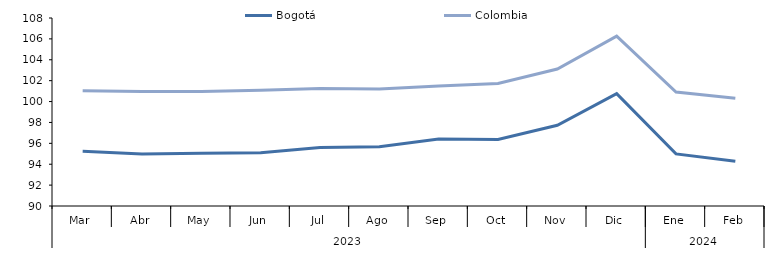
| Category | Bogotá | Colombia |
|---|---|---|
| 0 | 95.248 | 101.039 |
| 1 | 94.987 | 100.971 |
| 2 | 95.048 | 100.959 |
| 3 | 95.105 | 101.08 |
| 4 | 95.6 | 101.25 |
| 5 | 95.667 | 101.212 |
| 6 | 96.412 | 101.483 |
| 7 | 96.372 | 101.725 |
| 8 | 97.734 | 103.117 |
| 9 | 100.758 | 106.261 |
| 10 | 94.989 | 100.906 |
| 11 | 94.285 | 100.322 |